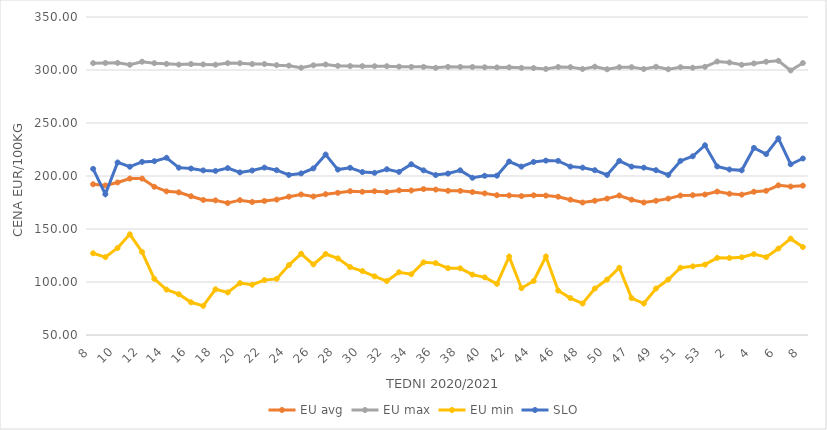
| Category | EU avg | EU max | EU min | SLO |
|---|---|---|---|---|
| 8.0 | 192.201 | 306.48 | 127.071 | 206.73 |
| 9.0 | 191.052 | 306.62 | 123.433 | 182.84 |
| 10.0 | 193.933 | 306.73 | 132.064 | 212.78 |
| 11.0 | 197.552 | 304.92 | 145.006 | 208.73 |
| 12.0 | 197.533 | 307.82 | 128.293 | 213.32 |
| 13.0 | 189.839 | 306.44 | 103.04 | 213.96 |
| 14.0 | 185.504 | 305.8 | 92.836 | 217.19 |
| 15.0 | 184.591 | 305.08 | 88.508 | 207.87 |
| 16.0 | 180.892 | 305.63 | 80.873 | 207.05 |
| 17.0 | 177.437 | 305.27 | 77.506 | 205.29 |
| 18.0 | 176.995 | 305.01 | 93.104 | 204.82 |
| 19.0 | 174.49 | 306.49 | 90.169 | 207.44 |
| 20.0 | 177.204 | 306.38 | 98.928 | 203.41 |
| 21.0 | 175.519 | 305.66 | 97.454 | 205.19 |
| 22.0 | 176.473 | 305.64 | 101.792 | 207.91 |
| 23.0 | 177.741 | 304.59 | 102.918 | 205.46 |
| 24.0 | 180.501 | 304.1 | 115.936 | 201 |
| 25.0 | 182.568 | 302.13 | 126.655 | 202.43 |
| 26.0 | 180.667 | 304.43 | 116.597 | 207.19 |
| 27.0 | 182.833 | 305.22 | 126.397 | 220.25 |
| 28.0 | 184.121 | 303.88 | 122.317 | 206.06 |
| 29.0 | 185.712 | 303.73 | 114.082 | 207.73 |
| 30.0 | 185.141 | 303.63 | 110.314 | 203.73 |
| 31.0 | 185.621 | 303.57 | 105.336 | 203 |
| 32.0 | 184.887 | 303.58 | 100.908 | 206.36 |
| 33.0 | 186.411 | 303.17 | 109.191 | 203.88 |
| 34.0 | 186.338 | 302.96 | 107.355 | 211.07 |
| 35.0 | 187.628 | 302.99 | 118.534 | 205.34 |
| 36.0 | 187.19 | 302.05 | 117.814 | 200.88 |
| 37.0 | 186.038 | 302.98 | 113.058 | 202.29 |
| 38.0 | 185.986 | 302.94 | 112.896 | 205.33 |
| 39.0 | 184.836 | 302.88 | 106.953 | 198.33 |
| 40.0 | 183.595 | 302.56 | 104.426 | 200.21 |
| 41.0 | 181.893 | 302.44 | 98.23 | 200.3 |
| 42.0 | 181.671 | 302.52 | 123.908 | 213.66 |
| 43.0 | 181.023 | 302.01 | 94.177 | 208.86 |
| 44.0 | 181.795 | 301.86 | 100.908 | 213.25 |
| 45.0 | 181.489 | 300.98 | 124 | 214.51 |
| 46.0 | 180.473 | 302.82 | 91.889 | 214.27 |
| 47.0 | 177.656 | 302.7 | 84.832 | 208.87 |
| 48.0 | 174.977 | 300.94 | 79.697 | 207.9 |
| 49.0 | 176.65 | 303.09 | 93.873 | 205.48 |
| 50.0 | 178.648 | 300.7 | 102.316 | 200.99 |
| 51.0 | 181.58 | 302.62 | 113.46 | 214.25 |
| 47.0 | 177.656 | 302.7 | 84.832 | 208.87 |
| 48.0 | 174.977 | 300.94 | 79.697 | 207.9 |
| 49.0 | 176.65 | 303.09 | 93.873 | 205.48 |
| 50.0 | 178.648 | 300.7 | 102.316 | 200.99 |
| 51.0 | 181.58 | 302.62 | 113.46 | 214.25 |
| 52.0 | 181.9 | 302.14 | 114.76 | 218.61 |
| 53.0 | 182.536 | 303 | 116.375 | 229 |
| 1.0 | 185.3 | 308 | 122.769 | 209 |
| 2.0 | 183.25 | 307.1 | 122.609 | 206.15 |
| 3.0 | 182.393 | 304.91 | 123.32 | 205.35 |
| 4.0 | 185.158 | 306.22 | 126.329 | 226.48 |
| 5.0 | 186.04 | 307.79 | 123.461 | 220.65 |
| 6.0 | 191.206 | 308.7 | 131.528 | 235.46 |
| 7.0 | 190.028 | 299.55 | 140.902 | 211.1 |
| 8.0 | 190.875 | 306.55 | 132.97 | 216.51 |